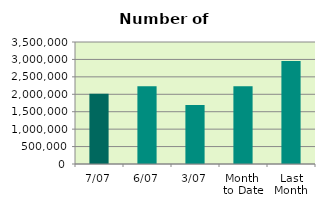
| Category | Series 0 |
|---|---|
| 7/07 | 2013208 |
| 6/07 | 2230840 |
| 3/07 | 1693410 |
| Month 
to Date | 2228594.4 |
| Last
Month | 2956123.091 |